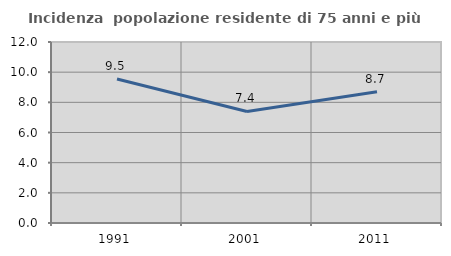
| Category | Incidenza  popolazione residente di 75 anni e più |
|---|---|
| 1991.0 | 9.546 |
| 2001.0 | 7.393 |
| 2011.0 | 8.696 |